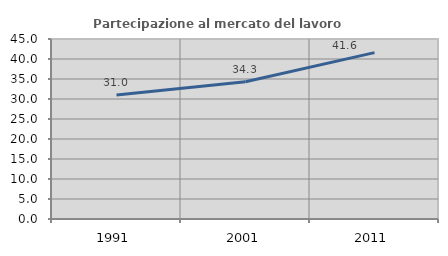
| Category | Partecipazione al mercato del lavoro  femminile |
|---|---|
| 1991.0 | 30.987 |
| 2001.0 | 34.291 |
| 2011.0 | 41.59 |